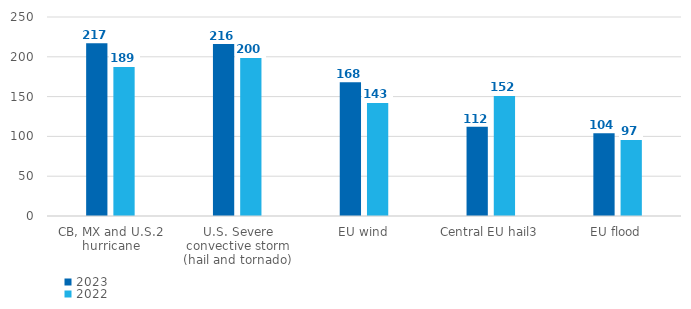
| Category | 2023 | 2022 |
|---|---|---|
| CB, MX and U.S.2 hurricane | 217 | 189 |
| U.S. Severe convective storm (hail and tornado) | 216 | 200 |
| EU wind | 168 | 143 |
| Central EU hail3 | 112 | 152 |
| EU flood | 104 | 97 |